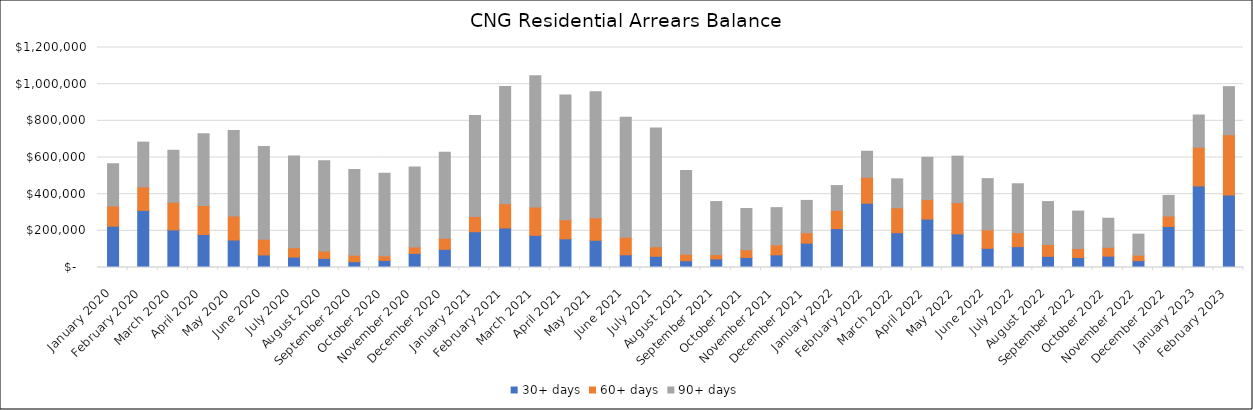
| Category | 30+ days | 60+ days | 90+ days |
|---|---|---|---|
| 2020-01-01 | 225478.23 | 110245.69 | 230180.48 |
| 2020-02-01 | 311401.79 | 128369.08 | 244095.28 |
| 2020-03-01 | 205183.57 | 150702.07 | 283579.55 |
| 2020-04-01 | 179937.2 | 158744.62 | 390313.12 |
| 2020-05-01 | 150028.7 | 130574.31 | 466744.58 |
| 2020-06-01 | 68469.85 | 84947.48 | 506833.14 |
| 2020-07-01 | 56855.84 | 50449.04 | 500482.77 |
| 2020-08-01 | 49855.37 | 40724.3 | 491335.47 |
| 2020-09-01 | 31818.85 | 34499.22 | 468793.37 |
| 2020-10-01 | 38535.9 | 25242.09 | 450378.27 |
| 2020-11-01 | 76983.99 | 34295.39 | 436680.7 |
| 2020-12-01 | 99248.14 | 59672.11 | 469199.57 |
| 2021-01-01 | 195241.68 | 82979.22 | 550200.43 |
| 2021-02-01 | 215529.42 | 132405.66 | 639820.81 |
| 2021-03-01 | 175387 | 154533.4 | 715669 |
| 2021-04-01 | 156384.4 | 104645.23 | 679637.55 |
| 2021-05-01 | 148323.21 | 122696.86 | 687371.54 |
| 2021-06-01 | 69506.99 | 95608.01 | 654576.93 |
| 2021-07-01 | 61319.21 | 51848.36 | 647694.35 |
| 2021-08-01 | 36978.23 | 34708.91 | 456916.41 |
| 2021-09-01 | 46592.28 | 23793.15 | 289351.91 |
| 2021-10-01 | 54823.28 | 42504.47 | 224424.8 |
| 2021-11-01 | 69135.59 | 53800.75 | 203615.88 |
| 2021-12-01 | 132798.27 | 56735.53 | 176462.92 |
| 2022-01-01 | 212321.91 | 99563.6 | 134961.91 |
| 2022-02-01 | 350673.38 | 141681.09 | 141681.09 |
| 2022-03-01 | 189858.08 | 136033.7 | 157597.38 |
| 2022-04-01 | 263982.23 | 106280.47 | 230861.37 |
| 2022-05-01 | 183378.55 | 170284.7 | 253750.8 |
| 2022-06-01 | 104583.83 | 100901.22 | 279227.18 |
| 2022-07-01 | 113715.39 | 76450.46 | 266625.64 |
| 2022-08-01 | 60880.18 | 64390.07 | 234212.4 |
| 2022-09-01 | 54513.64 | 48732.65 | 204414.49 |
| 2022-10-01 | 61817.76 | 48276.53 | 158493.24 |
| 2022-11-01 | 37269.68 | 29995.39 | 114611.78 |
| 2022-12-01 | 223793.07 | 57049.41 | 112249.09 |
| 2023-01-01 | 444903.51 | 211002.43 | 175835.48 |
| 2023-02-01 | 395341.02 | 329033.15 | 262155.05 |